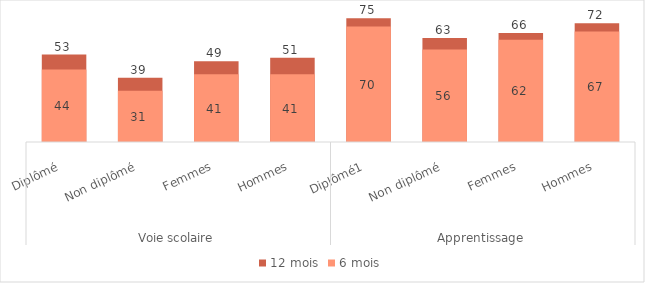
| Category | 12 mois | 6 mois |
|---|---|---|
| 0 | 53 | 44 |
| 1 | 39 | 31 |
| 2 | 49 | 41 |
| 3 | 51 | 41 |
| 4 | 75 | 70 |
| 5 | 63 | 56 |
| 6 | 66 | 62 |
| 7 | 72 | 67 |